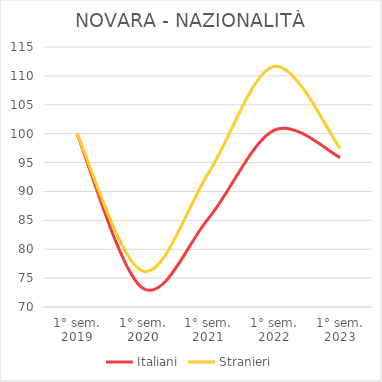
| Category | Italiani | Stranieri |
|---|---|---|
| 1° sem.
2019 | 100 | 100 |
| 1° sem.
2020 | 73.255 | 76.203 |
| 1° sem.
2021 | 85.332 | 93.165 |
| 1° sem.
2022 | 100.627 | 111.646 |
| 1° sem.
2023 | 95.863 | 97.468 |